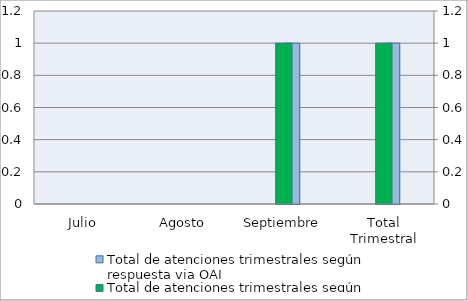
| Category | Total de atenciones trimestrales según respuesta via OAI | Series 2 | Series 4 |
|---|---|---|---|
| Julio | 0 |  |  |
| Agosto | 0 |  |  |
| Septiembre | 1 |  |  |
| Total Trimestral | 1 |  |  |